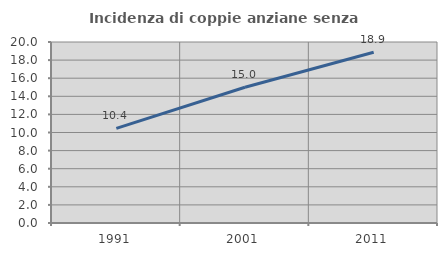
| Category | Incidenza di coppie anziane senza figli  |
|---|---|
| 1991.0 | 10.45 |
| 2001.0 | 15 |
| 2011.0 | 18.866 |